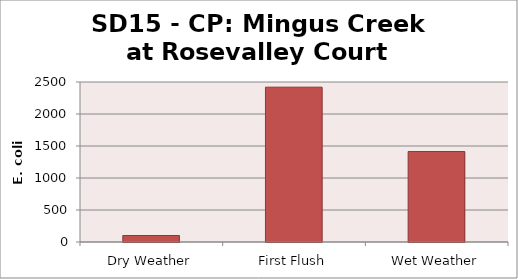
| Category | E. coli MPN |
|---|---|
| Dry Weather | 101.4 |
| First Flush | 2419.2 |
| Wet Weather | 1413.6 |